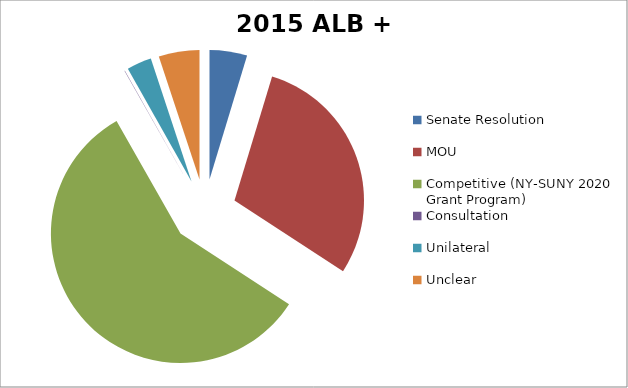
| Category | Series 0 |
|---|---|
| Senate Resolution | 123634000 |
| MOU | 777856000 |
| Competitive (NY-SUNY 2020 Grant Program) | 1518867000 |
| Consultation | 1179900 |
| Unilateral | 81500234 |
| Unclear | 134117000 |